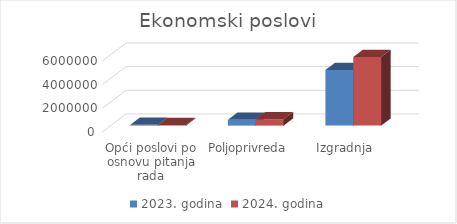
| Category | 2023. godina | 2024. godina |
|---|---|---|
| Opći poslovi po osnovu pitanja rada | 70000 | 50000 |
| Poljoprivreda | 488000 | 540561 |
| Izgradnja | 4695166 | 5795702 |